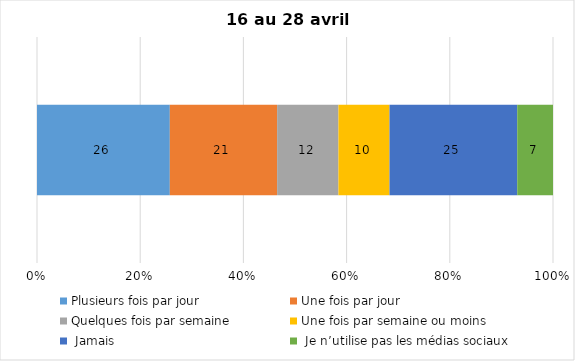
| Category | Plusieurs fois par jour | Une fois par jour | Quelques fois par semaine   | Une fois par semaine ou moins   |  Jamais   |  Je n’utilise pas les médias sociaux |
|---|---|---|---|---|---|---|
| 0 | 26 | 21 | 12 | 10 | 25 | 7 |